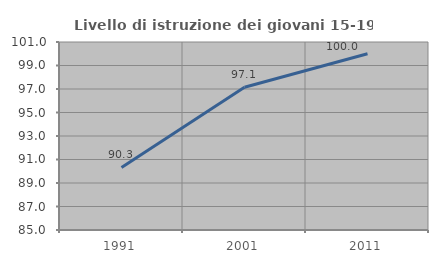
| Category | Livello di istruzione dei giovani 15-19 anni |
|---|---|
| 1991.0 | 90.323 |
| 2001.0 | 97.143 |
| 2011.0 | 100 |